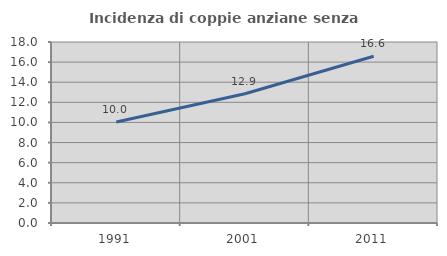
| Category | Incidenza di coppie anziane senza figli  |
|---|---|
| 1991.0 | 10.049 |
| 2001.0 | 12.858 |
| 2011.0 | 16.587 |